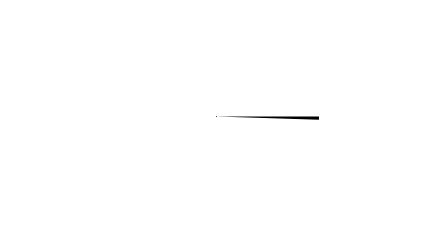
| Category | Pointer |
|---|---|
| 0 | 100 |
| 1 | 1 |
| 2 | 99 |